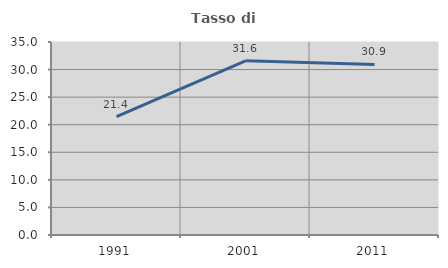
| Category | Tasso di occupazione   |
|---|---|
| 1991.0 | 21.448 |
| 2001.0 | 31.579 |
| 2011.0 | 30.941 |